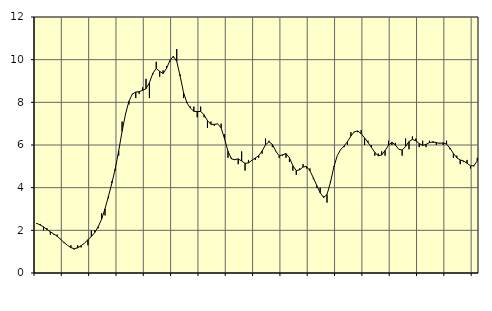
| Category | Piggar | Series 1 |
|---|---|---|
| nan | 2.3 | 2.33 |
| 87.0 | 2.3 | 2.25 |
| 87.0 | 2 | 2.16 |
| 87.0 | 2.1 | 2.04 |
| nan | 1.8 | 1.93 |
| 88.0 | 1.8 | 1.83 |
| 88.0 | 1.8 | 1.72 |
| 88.0 | 1.6 | 1.58 |
| nan | 1.4 | 1.43 |
| 89.0 | 1.3 | 1.3 |
| 89.0 | 1.3 | 1.19 |
| 89.0 | 1.1 | 1.14 |
| nan | 1.3 | 1.18 |
| 90.0 | 1.2 | 1.28 |
| 90.0 | 1.4 | 1.4 |
| 90.0 | 1.3 | 1.56 |
| nan | 2 | 1.71 |
| 91.0 | 2 | 1.9 |
| 91.0 | 2.1 | 2.17 |
| 91.0 | 2.8 | 2.52 |
| nan | 2.7 | 3.01 |
| 92.0 | 3.5 | 3.59 |
| 92.0 | 4.3 | 4.21 |
| 92.0 | 4.8 | 4.89 |
| nan | 5.5 | 5.72 |
| 93.0 | 7.1 | 6.64 |
| 93.0 | 7.5 | 7.45 |
| 93.0 | 7.9 | 8.05 |
| nan | 8.4 | 8.39 |
| 94.0 | 8.2 | 8.48 |
| 94.0 | 8.4 | 8.5 |
| 94.0 | 8.7 | 8.56 |
| nan | 9.1 | 8.64 |
| 95.0 | 8.2 | 8.92 |
| 95.0 | 9.3 | 9.36 |
| 95.0 | 9.9 | 9.59 |
| nan | 9.2 | 9.45 |
| 96.0 | 9.5 | 9.35 |
| 96.0 | 9.7 | 9.59 |
| 96.0 | 9.9 | 9.96 |
| nan | 10.1 | 10.16 |
| 97.0 | 10.5 | 9.92 |
| 97.0 | 9.3 | 9.23 |
| 97.0 | 8.2 | 8.45 |
| nan | 8 | 7.97 |
| 98.0 | 7.8 | 7.73 |
| 98.0 | 7.8 | 7.58 |
| 98.0 | 7.3 | 7.57 |
| nan | 7.8 | 7.57 |
| 99.0 | 7.3 | 7.42 |
| 99.0 | 6.8 | 7.14 |
| 99.0 | 7.1 | 6.97 |
| nan | 6.9 | 6.97 |
| 0.0 | 7 | 6.99 |
| 0.0 | 7 | 6.8 |
| 0.0 | 6.5 | 6.29 |
| nan | 5.4 | 5.71 |
| 1.0 | 5.4 | 5.35 |
| 1.0 | 5.3 | 5.31 |
| 1.0 | 5.1 | 5.35 |
| nan | 5.7 | 5.25 |
| 2.0 | 4.8 | 5.14 |
| 2.0 | 5.3 | 5.16 |
| 2.0 | 5.3 | 5.28 |
| nan | 5.3 | 5.39 |
| 3.0 | 5.4 | 5.5 |
| 3.0 | 5.6 | 5.72 |
| 3.0 | 6.3 | 6.01 |
| nan | 6.2 | 6.15 |
| 4.0 | 5.9 | 6.03 |
| 4.0 | 5.7 | 5.71 |
| 4.0 | 5.4 | 5.49 |
| nan | 5.5 | 5.54 |
| 5.0 | 5.4 | 5.6 |
| 5.0 | 5.2 | 5.4 |
| 5.0 | 4.8 | 5.03 |
| nan | 4.6 | 4.8 |
| 6.0 | 4.9 | 4.84 |
| 6.0 | 5.1 | 4.97 |
| 6.0 | 4.9 | 4.99 |
| nan | 4.9 | 4.79 |
| 7.0 | 4.4 | 4.46 |
| 7.0 | 4 | 4.1 |
| 7.0 | 4 | 3.76 |
| nan | 3.6 | 3.54 |
| 8.0 | 3.3 | 3.68 |
| 8.0 | 4.3 | 4.24 |
| 8.0 | 5 | 4.97 |
| nan | 5.5 | 5.5 |
| 9.0 | 5.8 | 5.79 |
| 9.0 | 5.9 | 5.95 |
| 9.0 | 6 | 6.16 |
| nan | 6.6 | 6.42 |
| 10.0 | 6.6 | 6.62 |
| 10.0 | 6.6 | 6.66 |
| 10.0 | 6.7 | 6.53 |
| nan | 6 | 6.33 |
| 11.0 | 6.2 | 6.12 |
| 11.0 | 6 | 5.89 |
| 11.0 | 5.5 | 5.65 |
| nan | 5.6 | 5.5 |
| 12.0 | 5.7 | 5.53 |
| 12.0 | 5.5 | 5.74 |
| 12.0 | 6.2 | 5.99 |
| nan | 6 | 6.13 |
| 13.0 | 6.1 | 6 |
| 13.0 | 5.8 | 5.8 |
| 13.0 | 5.5 | 5.76 |
| nan | 6.3 | 5.93 |
| 14.0 | 5.8 | 6.16 |
| 14.0 | 6.4 | 6.26 |
| 14.0 | 6.3 | 6.2 |
| nan | 5.9 | 6.07 |
| 15.0 | 6.2 | 5.98 |
| 15.0 | 5.9 | 6.03 |
| 15.0 | 6.2 | 6.11 |
| nan | 6.1 | 6.15 |
| 16.0 | 6 | 6.11 |
| 16.0 | 6.1 | 6.08 |
| 16.0 | 6 | 6.1 |
| nan | 6.2 | 6.04 |
| 17.0 | 5.8 | 5.85 |
| 17.0 | 5.4 | 5.61 |
| 17.0 | 5.5 | 5.4 |
| nan | 5.1 | 5.3 |
| 18.0 | 5.2 | 5.25 |
| 18.0 | 5.3 | 5.15 |
| 18.0 | 4.9 | 5.02 |
| nan | 5 | 5.03 |
| 19.0 | 5.4 | 5.25 |